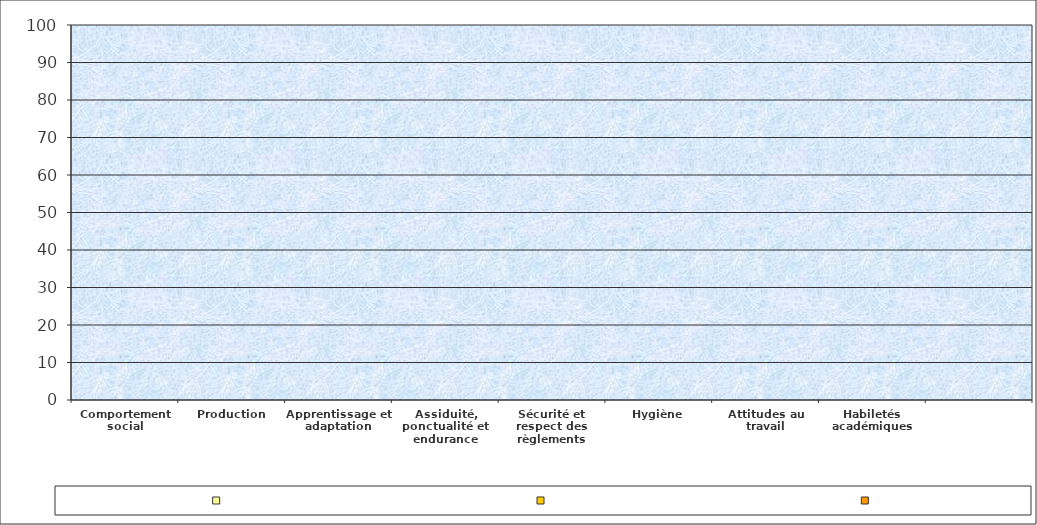
| Category | Series 3 | Series 5 | Series 7 |
|---|---|---|---|
| Comportement social | 0 | 0 | 0 |
| Production | 0 | 0 | 0 |
| Apprentissage et adaptation | 0 | 0 | 0 |
| Assiduité, ponctualité et endurance | 0 | 0 | 0 |
| Sécurité et respect des règlements | 0 | 0 | 0 |
| Hygiène | 0 | 0 | 0 |
| Attitudes au travail | 0 | 0 | 0 |
| Habiletés académiques | 0 | 0 | 0 |